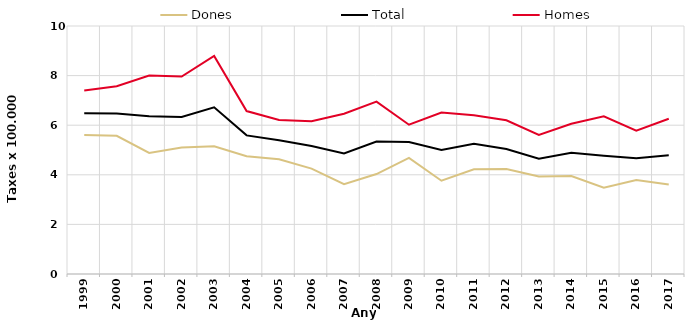
| Category | Dones | Total | Homes |
|---|---|---|---|
| 1999.0 | 5.6 | 6.48 | 7.4 |
| 2000.0 | 5.57 | 6.47 | 7.57 |
| 2001.0 | 4.88 | 6.36 | 8 |
| 2002.0 | 5.1 | 6.33 | 7.96 |
| 2003.0 | 5.15 | 6.72 | 8.79 |
| 2004.0 | 4.75 | 5.59 | 6.57 |
| 2005.0 | 4.63 | 5.39 | 6.21 |
| 2006.0 | 4.25 | 5.16 | 6.16 |
| 2007.0 | 3.62 | 4.86 | 6.46 |
| 2008.0 | 4.03 | 5.34 | 6.95 |
| 2009.0 | 4.68 | 5.32 | 6.02 |
| 2010.0 | 3.76 | 5 | 6.51 |
| 2011.0 | 4.22 | 5.25 | 6.4 |
| 2012.0 | 4.23 | 5.04 | 6.2 |
| 2013.0 | 3.93 | 4.65 | 5.61 |
| 2014.0 | 3.95 | 4.89 | 6.06 |
| 2015.0 | 3.48 | 4.77 | 6.36 |
| 2016.0 | 3.79 | 4.67 | 5.78 |
| 2017.0 | 3.61 | 4.79 | 6.26 |